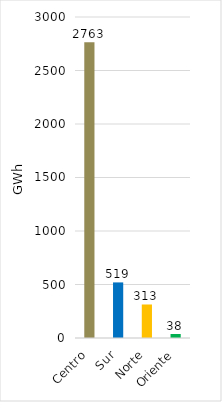
| Category | Series 0 |
|---|---|
| Centro | 2762.856 |
| Sur | 519.495 |
| Norte | 313.202 |
| Oriente | 37.603 |